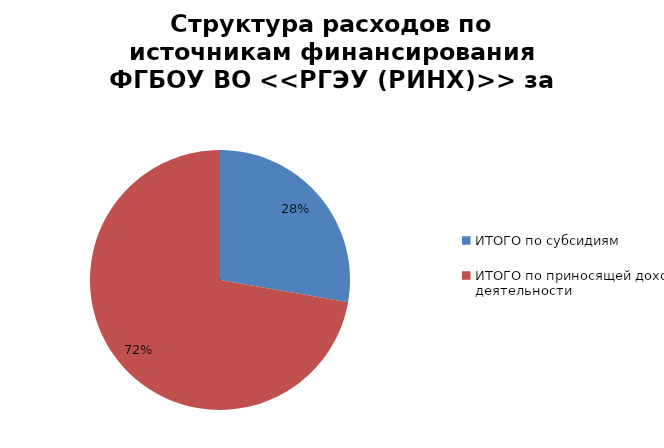
| Category | Series 0 |
|---|---|
| ИТОГО по субсидиям | 408152.7 |
| ИТОГО по приносящей доход деятельности | 1062697.4 |